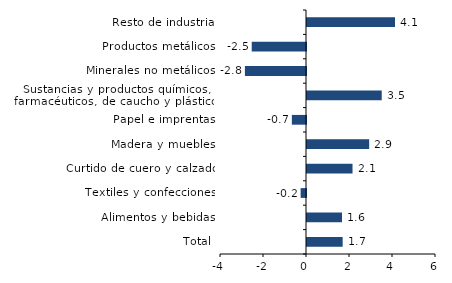
| Category | Series 0 |
|---|---|
| Total | 1.659 |
| Alimentos y bebidas | 1.628 |
| Textiles y confecciones | -0.25 |
| Curtido de cuero y calzado | 2.117 |
| Madera y muebles | 2.892 |
| Papel e imprentas | -0.659 |
| Sustancias y productos químicos, farmacéuticos, de caucho y plásticos | 3.476 |
| Minerales no metálicos | -2.842 |
| Productos metálicos | -2.524 |
| Resto de industria | 4.094 |